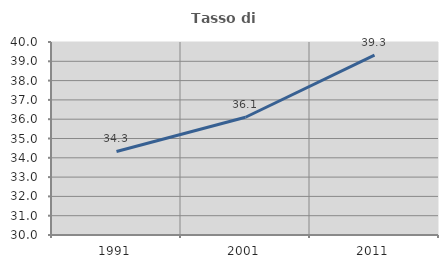
| Category | Tasso di occupazione   |
|---|---|
| 1991.0 | 34.327 |
| 2001.0 | 36.1 |
| 2011.0 | 39.321 |